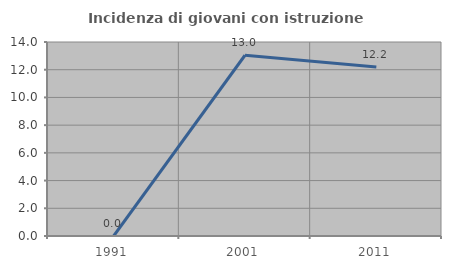
| Category | Incidenza di giovani con istruzione universitaria |
|---|---|
| 1991.0 | 0 |
| 2001.0 | 13.043 |
| 2011.0 | 12.195 |